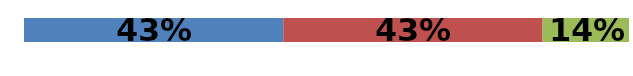
| Category | Series 0 | Series 1 | Series 2 |
|---|---|---|---|
| 0 | 0.429 | 0.429 | 0.143 |